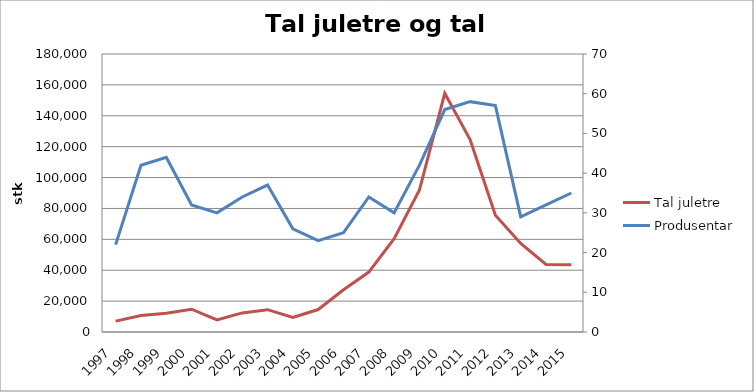
| Category | Tal juletre |
|---|---|
| 1997 | 7035 |
| 1998 | 10622 |
| 1999 | 12158 |
| 2000 | 14763 |
| 2001 | 7804 |
| 2002 | 12368 |
| 2003 | 14457 |
| 2004 | 9364 |
| 2005 | 14545 |
| 2006 | 27345 |
| 2007 | 38787 |
| 2008 | 60440 |
| 2009 | 91910 |
| 2010 | 154580 |
| 2011 | 124654 |
| 2012 | 75659 |
| 2013 | 57365 |
| 2014 | 43777 |
| 2015 | 43609 |